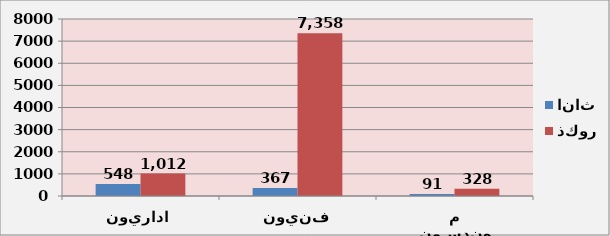
| Category | اناث | ذكور |
|---|---|---|
| اداريون | 548 | 1012 |
| فنيون | 367 | 7358 |
| مهندسون | 91 | 328 |